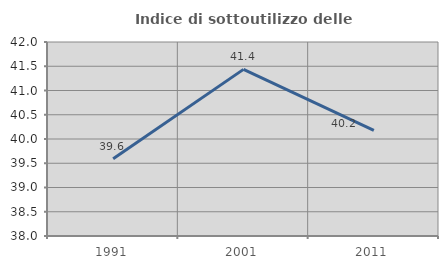
| Category | Indice di sottoutilizzo delle abitazioni  |
|---|---|
| 1991.0 | 39.593 |
| 2001.0 | 41.436 |
| 2011.0 | 40.176 |